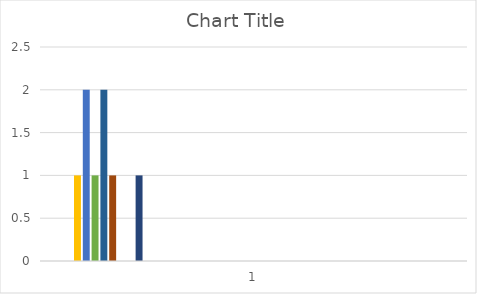
| Category | Series 0 | Series 1 | Series 2 | Series 3 | Series 4 | Series 5 | Series 6 | Series 7 | Series 8 | Series 9 | Series 10 | Series 11 | Series 12 | Series 13 | Series 14 | Series 15 | Series 16 | Series 17 | Series 18 | Series 19 | Series 20 | Series 21 | Series 22 | Series 23 | Series 24 | Series 25 | Series 26 | Series 27 | Series 28 | Series 29 | Series 30 | Series 31 | Series 32 | Series 33 | Series 34 | Series 35 | Series 36 | Series 37 | Series 38 | Series 39 | Series 40 | Series 41 | Series 42 | Series 43 | Series 44 | Series 45 | Series 46 |
|---|---|---|---|---|---|---|---|---|---|---|---|---|---|---|---|---|---|---|---|---|---|---|---|---|---|---|---|---|---|---|---|---|---|---|---|---|---|---|---|---|---|---|---|---|---|---|---|
| 0 | 0 | 0 | 0 | 1 | 2 | 1 | 2 | 1 | 0 | 0 | 1 | 0 | 0 | 0 | 0 | 0 | 0 | 0 | 0 | 0 | 0 | 0 | 0 | 0 | 0 | 0 | 0 | 0 | 0 | 0 | 0 | 0 | 0 | 0 | 0 | 0 | 0 | 0 | 0 | 0 | 0 | 0 | 0 | 0 | 0 | 0 | 0 |